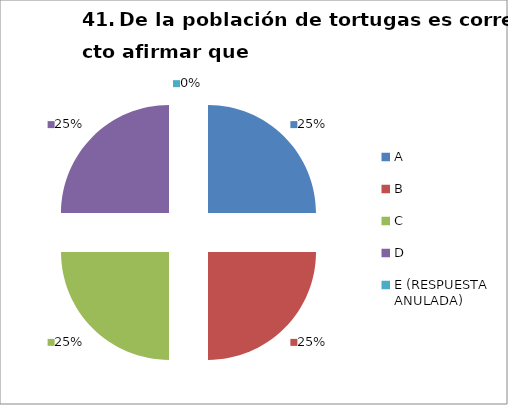
| Category | CANTIDAD DE RESPUESTAS PREGUNTA (41) | PORCENTAJE |
|---|---|---|
| A | 7 | 0.25 |
| B | 7 | 0.25 |
| C | 7 | 0.25 |
| D | 7 | 0.25 |
| E (RESPUESTA ANULADA) | 0 | 0 |